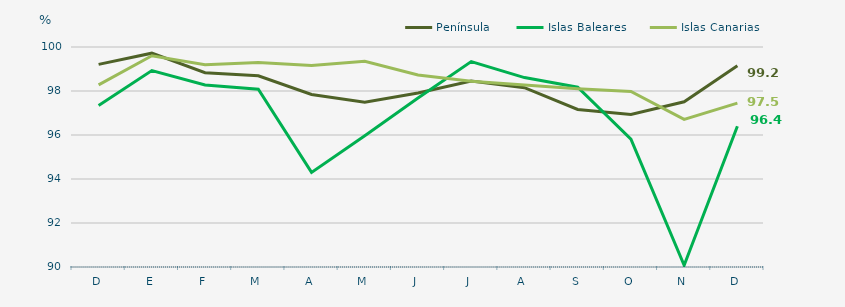
| Category | Península | Islas Baleares | Islas Canarias |
|---|---|---|---|
| D | 99.21 | 97.34 | 98.28 |
| E | 99.72 | 98.93 | 99.6 |
| F | 98.83 | 98.27 | 99.19 |
| M | 98.69 | 98.08 | 99.3 |
| A | 97.84 | 94.3 | 99.16 |
| M | 97.49 | 95.97 | 99.35 |
| J | 97.91 | 97.68 | 98.73 |
| J | 98.45 | 99.34 | 98.44 |
| A | 98.15 | 98.61 | 98.27 |
| S | 97.16 | 98.17 | 98.1 |
| O | 96.93 | 95.81 | 97.98 |
| N | 97.51 | 90.08 | 96.71 |
| D | 99.15 | 96.4 | 97.45 |